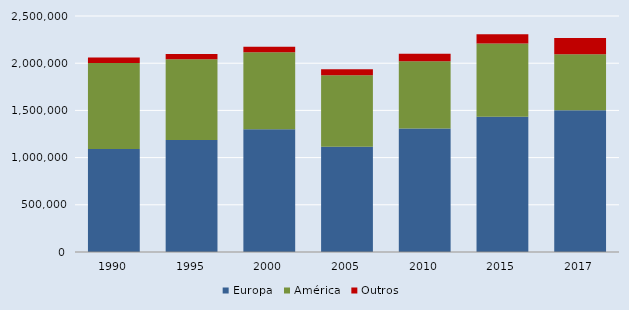
| Category | Europa | América | Outros |
|---|---|---|---|
| 1990.0 | 1092141 | 910907 | 57742 |
| 1995.0 | 1187356 | 853198 | 56635 |
| 2000.0 | 1301084 | 815315 | 58045 |
| 2005.0 | 1114618 | 758905 | 62543 |
| 2010.0 | 1308130 | 712886 | 77881 |
| 2015.0 | 1433482 | 775050 | 97789 |
| 2017.0 | 1502151 | 592642 | 171939 |